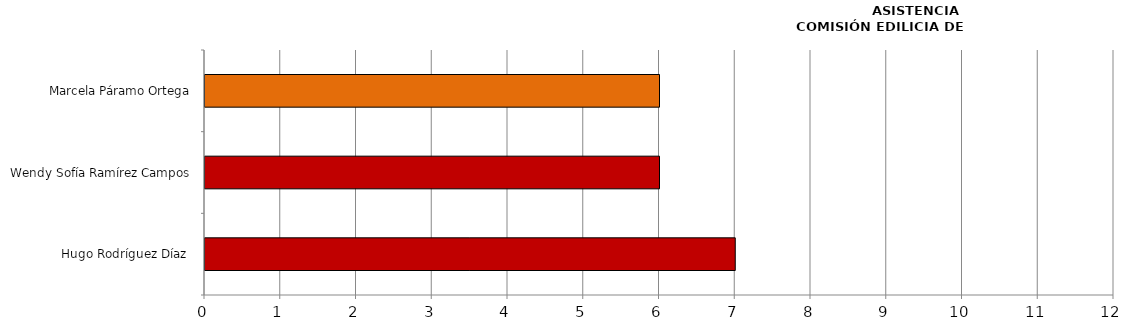
| Category | Series 0 |
|---|---|
| Hugo Rodríguez Díaz  | 7 |
| Wendy Sofía Ramírez Campos | 6 |
| Marcela Páramo Ortega | 6 |